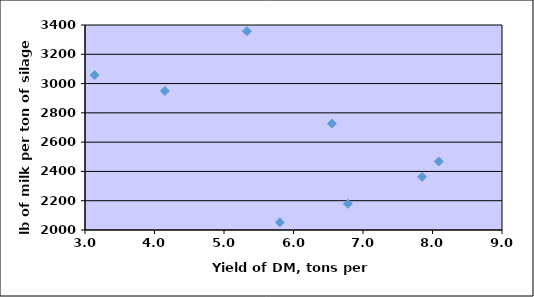
| Category | Series 0 |
|---|---|
| 4.14972815 | 2949.5 |
| 7.85 | 2363 |
| 3.13813725 | 3057.75 |
| 5.3291275 | 3358 |
| 6.7828488 | 2179 |
| 5.80457377 | 2052.5 |
| 6.5529674 | 2726.75 |
| 8.09 | 2467.75 |